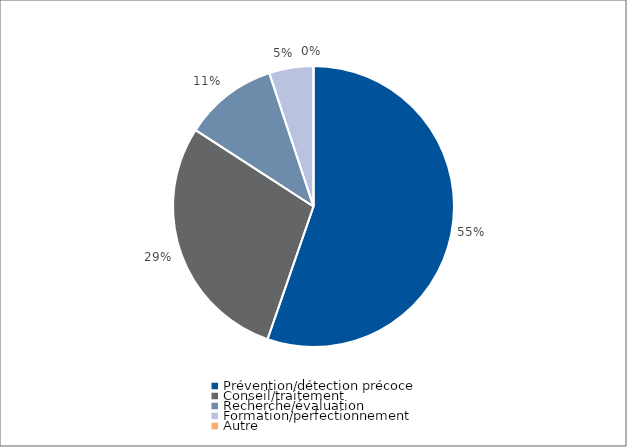
| Category | Series 0 |
|---|---|
| Prévention/détection précoce | 89750 |
| Conseil/traitement | 46815 |
| Recherche/évaluation | 17450 |
| Formation/perfectionnement | 8270 |
| Autre | 0 |